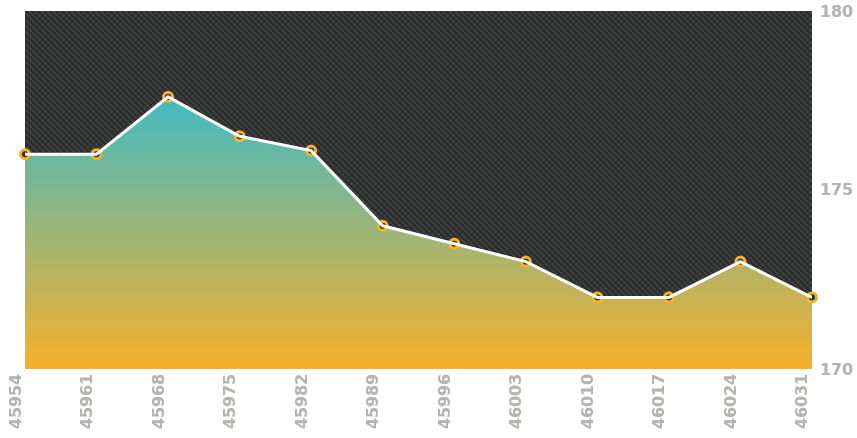
| Category | Progress Shading |
|---|---|
| 2018-11-22 | 176 |
| 2018-11-29 | 176 |
| 2018-12-06 | 177.6 |
| 2018-12-13 | 176.5 |
| 2018-12-20 | 176.1 |
| 2018-12-27 | 174 |
| 2019-01-03 | 173.5 |
| 2019-01-10 | 173 |
| 2019-01-17 | 172 |
| 2019-01-24 | 172 |
| 2019-01-31 | 173 |
| 2019-02-07 | 172 |